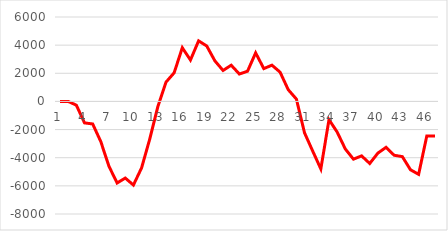
| Category | Series 0 |
|---|---|
| 0 | 0 |
| 1 | 0 |
| 2 | -268.24 |
| 3 | -1525.98 |
| 4 | -1599.99 |
| 5 | -2859 |
| 6 | -4610.14 |
| 7 | -5796.68 |
| 8 | -5445.11 |
| 9 | -5943.04 |
| 10 | -4727.61 |
| 11 | -2683.77 |
| 12 | -360.62 |
| 13 | 1371.61 |
| 14 | 2036.32 |
| 15 | 3816.76 |
| 16 | 2941.26 |
| 17 | 4305.34 |
| 18 | 3938.78 |
| 19 | 2879.28 |
| 20 | 2201.48 |
| 21 | 2573.91 |
| 22 | 1947.89 |
| 23 | 2145.58 |
| 24 | 3450.16 |
| 25 | 2332.45 |
| 26 | 2576.64 |
| 27 | 2078.38 |
| 28 | 832.73 |
| 29 | 166.79 |
| 30 | -2236.23 |
| 31 | -3526.26 |
| 32 | -4797.45 |
| 33 | -1295.77 |
| 34 | -2172.55 |
| 35 | -3376.82 |
| 36 | -4103.38 |
| 37 | -3868.9 |
| 38 | -4410.42 |
| 39 | -3672.32 |
| 40 | -3263.41 |
| 41 | -3827.31 |
| 42 | -3921.31 |
| 43 | -4856.56 |
| 44 | -5181.59 |
| 45 | -2462.22 |
| 46 | -2454.92 |